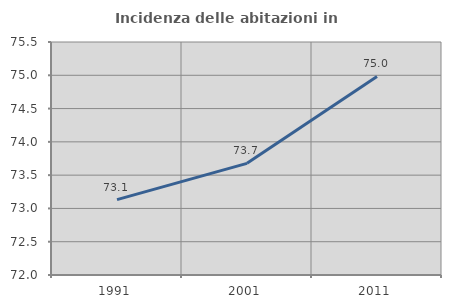
| Category | Incidenza delle abitazioni in proprietà  |
|---|---|
| 1991.0 | 73.132 |
| 2001.0 | 73.677 |
| 2011.0 | 74.982 |